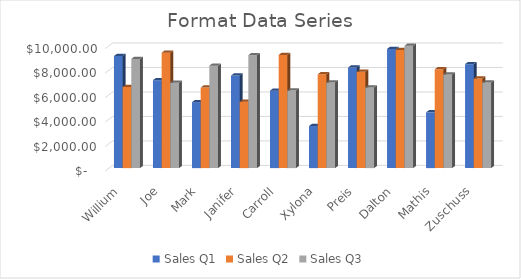
| Category |  Sales  |
|---|---|
|  Willium  | 8920 |
|  Joe  | 6978 |
|  Mark  | 8374 |
|  Janifer  | 9232 |
|  Carroll  | 6334 |
|  Xylona  | 6992 |
|  Preis  | 6591 |
|  Dalton  | 9993 |
|  Mathis  | 7656 |
|  Zuschuss  | 6998 |